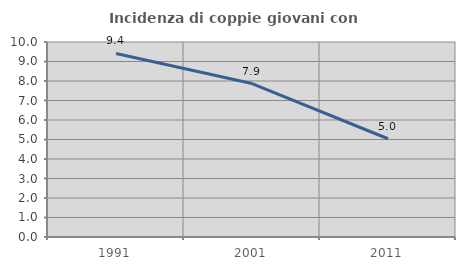
| Category | Incidenza di coppie giovani con figli |
|---|---|
| 1991.0 | 9.412 |
| 2001.0 | 7.869 |
| 2011.0 | 5.038 |